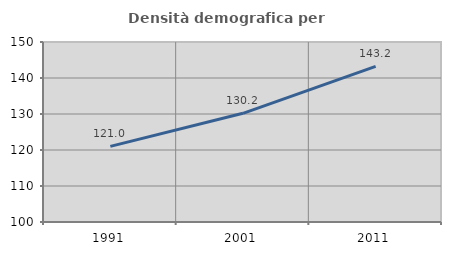
| Category | Densità demografica |
|---|---|
| 1991.0 | 121.006 |
| 2001.0 | 130.193 |
| 2011.0 | 143.246 |